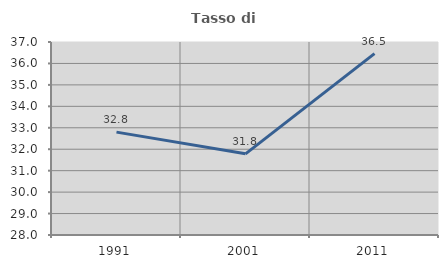
| Category | Tasso di occupazione   |
|---|---|
| 1991.0 | 32.798 |
| 2001.0 | 31.786 |
| 2011.0 | 36.455 |